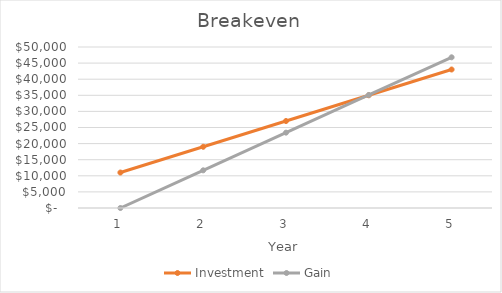
| Category | Investment | Gain |
|---|---|---|
| 0 | 11010 | 0 |
| 1 | 19010 | 11700 |
| 2 | 27010 | 23400 |
| 3 | 35010 | 35100 |
| 4 | 43010 | 46800 |